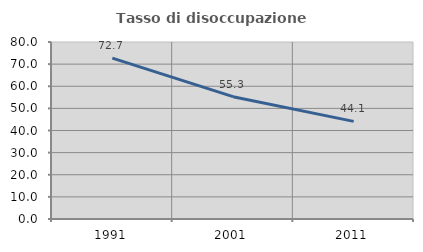
| Category | Tasso di disoccupazione giovanile  |
|---|---|
| 1991.0 | 72.691 |
| 2001.0 | 55.285 |
| 2011.0 | 44.118 |